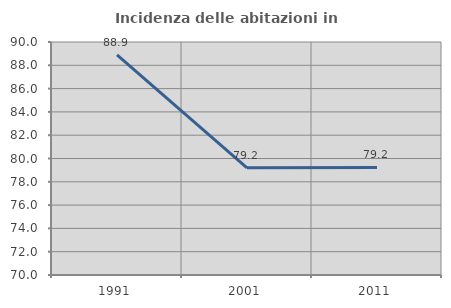
| Category | Incidenza delle abitazioni in proprietà  |
|---|---|
| 1991.0 | 88.889 |
| 2001.0 | 79.2 |
| 2011.0 | 79.231 |